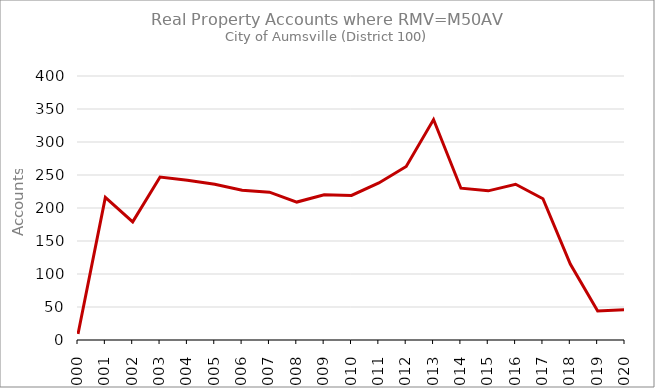
| Category | Series 0 |
|---|---|
| 2000.0 | 9 |
| 2001.0 | 216 |
| 2002.0 | 179 |
| 2003.0 | 247 |
| 2004.0 | 242 |
| 2005.0 | 236 |
| 2006.0 | 227 |
| 2007.0 | 224 |
| 2008.0 | 209 |
| 2009.0 | 220 |
| 2010.0 | 219 |
| 2011.0 | 238 |
| 2012.0 | 263 |
| 2013.0 | 334 |
| 2014.0 | 230 |
| 2015.0 | 226 |
| 2016.0 | 236 |
| 2017.0 | 214 |
| 2018.0 | 115 |
| 2019.0 | 44 |
| 2020.0 | 46 |